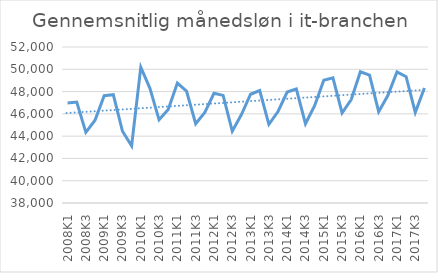
| Category | Gennemsnitlig månedsløn |
|---|---|
| 2008K1 | 46983.82 |
| 2008K2 | 47055.204 |
| 2008K3 | 44342.78 |
| 2008K4 | 45426.751 |
| 2009K1 | 47632.446 |
| 2009K2 | 47721.026 |
| 2009K3 | 44439.762 |
| 2009K4 | 43128.921 |
| 2010K1 | 50181.735 |
| 2010K2 | 48290.523 |
| 2010K3 | 45464.419 |
| 2010K4 | 46388.802 |
| 2011K1 | 48761.433 |
| 2011K2 | 48041.264 |
| 2011K3 | 45110.192 |
| 2011K4 | 46125.414 |
| 2012K1 | 47849.436 |
| 2012K2 | 47656.166 |
| 2012K3 | 44448.352 |
| 2012K4 | 45941.27 |
| 2013K1 | 47760.317 |
| 2013K2 | 48093.549 |
| 2013K3 | 45057.006 |
| 2013K4 | 46210.504 |
| 2014K1 | 47954.058 |
| 2014K2 | 48233.019 |
| 2014K3 | 45113.748 |
| 2014K4 | 46726.219 |
| 2015K1 | 49018.44 |
| 2015K2 | 49240.467 |
| 2015K3 | 46077.317 |
| 2015K4 | 47285.652 |
| 2016K1 | 49775.881 |
| 2016K2 | 49483.22 |
| 2016K3 | 46195.881 |
| 2016K4 | 47644.389 |
| 2017K1 | 49765.217 |
| 2017K2 | 49336.268 |
| 2017K3 | 46131.799 |
| 2017K4 | 48324.072 |